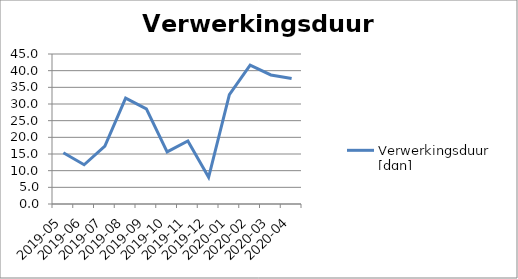
| Category | Verwerkingsduur [dgn] |
|---|---|
| 2019-05 | 15.369 |
| 2019-06 | 11.77 |
| 2019-07 | 17.384 |
| 2019-08 | 31.77 |
| 2019-09 | 28.532 |
| 2019-10 | 15.631 |
| 2019-11 | 18.932 |
| 2019-12 | 8.022 |
| 2020-01 | 32.833 |
| 2020-02 | 41.654 |
| 2020-03 | 38.718 |
| 2020-04 | 37.62 |